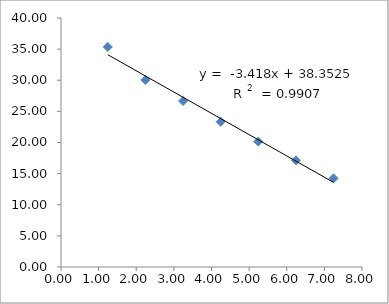
| Category | Series 0 |
|---|---|
| 7.243570156332262 | 14.24 |
| 6.243570156332261 | 17.13 |
| 5.243570156332261 | 20.15 |
| 4.243570156332262 | 23.34 |
| 3.2435701563322614 | 26.665 |
| 2.2435701563322614 | 30.06 |
| 1.2435701563322614 | 35.35 |